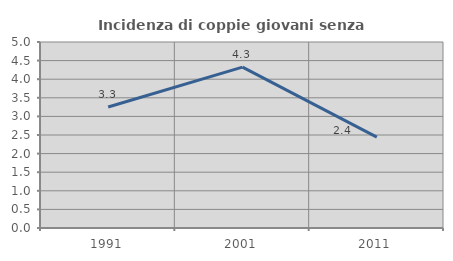
| Category | Incidenza di coppie giovani senza figli |
|---|---|
| 1991.0 | 3.252 |
| 2001.0 | 4.324 |
| 2011.0 | 2.443 |